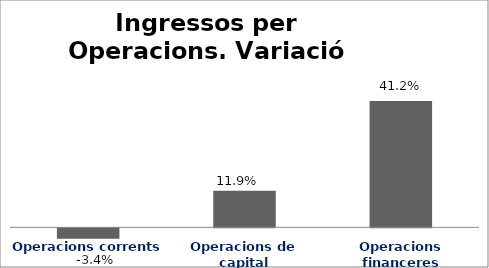
| Category | Series 0 |
|---|---|
| Operacions corrents | -0.034 |
| Operacions de capital | 0.119 |
| Operacions financeres | 0.412 |